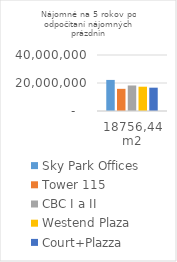
| Category | Sky Park Offices | Tower 115 | CBC I a II | Westend Plaza | Court+Plazza |
|---|---|---|---|---|---|
| 18756,44 m2 | 22195281.9 | 15833175.098 | 18232157.592 | 17354046.69 | 16656566.69 |